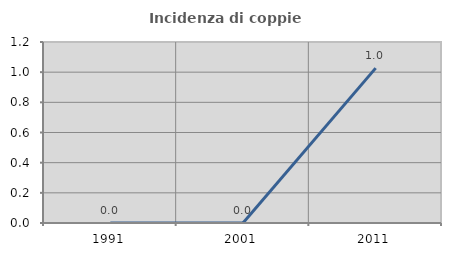
| Category | Incidenza di coppie miste |
|---|---|
| 1991.0 | 0 |
| 2001.0 | 0 |
| 2011.0 | 1.027 |